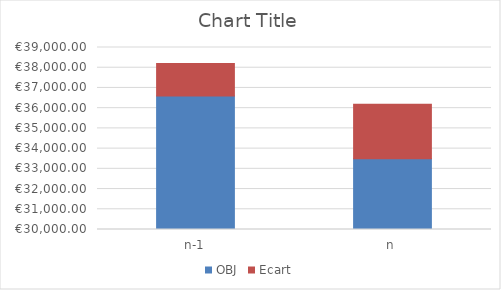
| Category | OBJ | Ecart |
|---|---|---|
| n-1 | 36600 | 1606 |
| n | 33500 | 2693 |